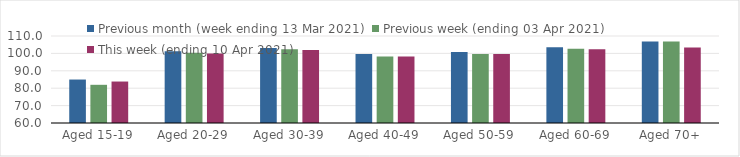
| Category | Previous month (week ending 13 Mar 2021) | Previous week (ending 03 Apr 2021) | This week (ending 10 Apr 2021) |
|---|---|---|---|
| Aged 15-19 | 84.98 | 81.95 | 83.83 |
| Aged 20-29 | 101.25 | 100.34 | 99.91 |
| Aged 30-39 | 103.13 | 102.39 | 101.99 |
| Aged 40-49 | 99.71 | 98.27 | 98.18 |
| Aged 50-59 | 100.75 | 99.67 | 99.64 |
| Aged 60-69 | 103.5 | 102.65 | 102.37 |
| Aged 70+ | 106.78 | 106.77 | 103.45 |